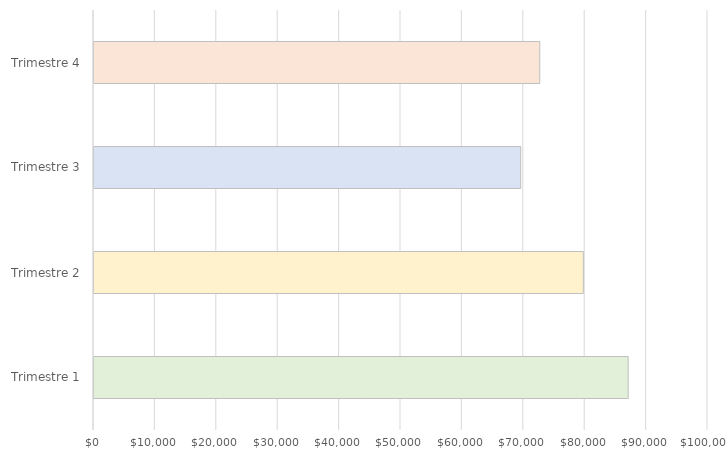
| Category | Series 0 |
|---|---|
| Trimestre 1 | 87000 |
| Trimestre 2 | 79700 |
| Trimestre 3 | 69500 |
| Trimestre 4 | 72600 |